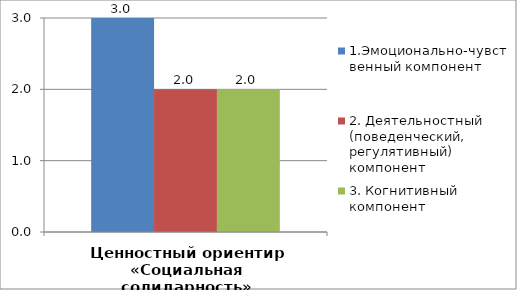
| Category | 1.Эмоционально-чувственный компонент | 2. Деятельностный (поведенческий, регулятивный) компонент | 3. Когнитивный компонент |
|---|---|---|---|
| Ценностный ориентир «Социальная солидарность» | 3 | 2 | 2 |